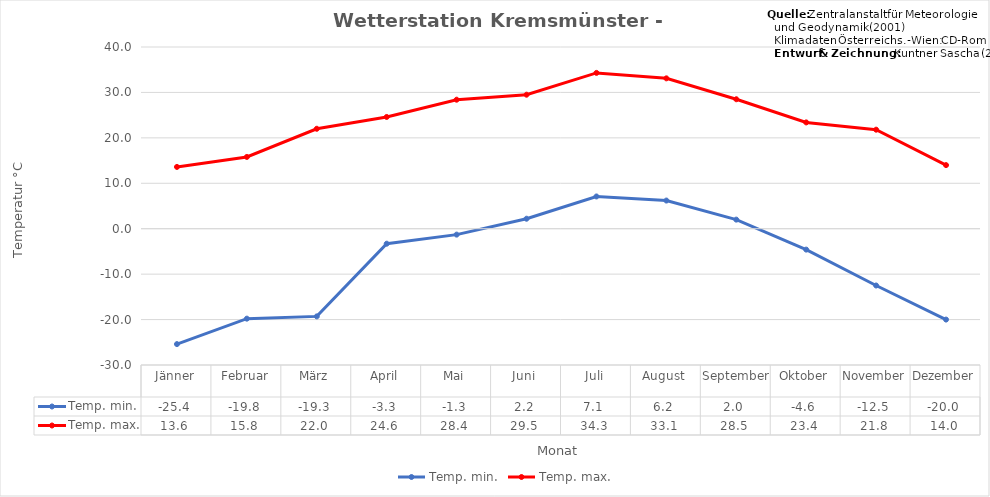
| Category | Temp. min. | Temp. max. |
|---|---|---|
| Jänner | -25.4 | 13.6 |
| Februar | -19.8 | 15.8 |
| März | -19.3 | 22 |
| April | -3.3 | 24.6 |
| Mai | -1.3 | 28.4 |
| Juni | 2.2 | 29.5 |
| Juli | 7.1 | 34.3 |
| August | 6.2 | 33.1 |
| September | 2 | 28.5 |
| Oktober | -4.6 | 23.4 |
| November | -12.5 | 21.8 |
| Dezember | -20 | 14 |